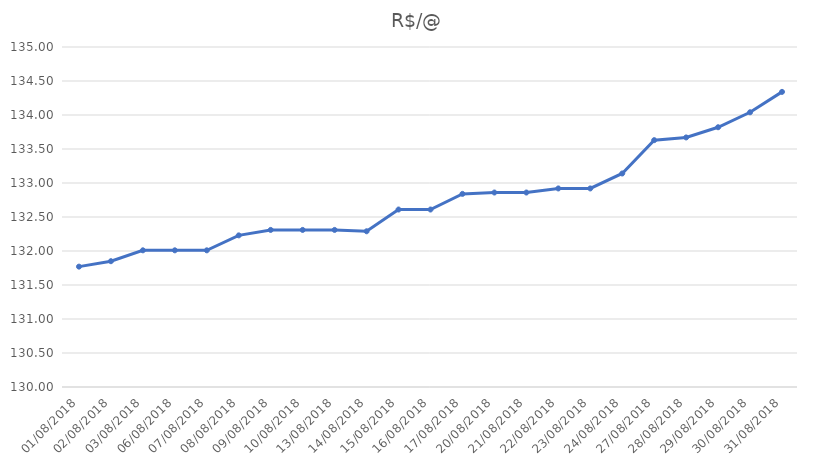
| Category | R$/@ |
|---|---|
| 01/08/2018 | 131.77 |
| 02/08/2018 | 131.85 |
| 03/08/2018 | 132.01 |
| 06/08/2018 | 132.01 |
| 07/08/2018 | 132.01 |
| 08/08/2018 | 132.23 |
| 09/08/2018 | 132.31 |
| 10/08/2018 | 132.31 |
| 13/08/2018 | 132.31 |
| 14/08/2018 | 132.29 |
| 15/08/2018 | 132.61 |
| 16/08/2018 | 132.61 |
| 17/08/2018 | 132.84 |
| 20/08/2018 | 132.86 |
| 21/08/2018 | 132.86 |
| 22/08/2018 | 132.92 |
| 23/08/2018 | 132.92 |
| 24/08/2018 | 133.14 |
| 27/08/2018 | 133.63 |
| 28/08/2018 | 133.67 |
| 29/08/2018 | 133.82 |
| 30/08/2018 | 134.04 |
| 31/08/2018 | 134.34 |